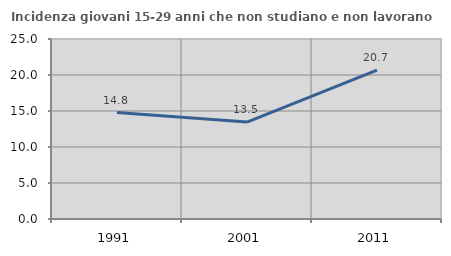
| Category | Incidenza giovani 15-29 anni che non studiano e non lavorano  |
|---|---|
| 1991.0 | 14.783 |
| 2001.0 | 13.462 |
| 2011.0 | 20.663 |